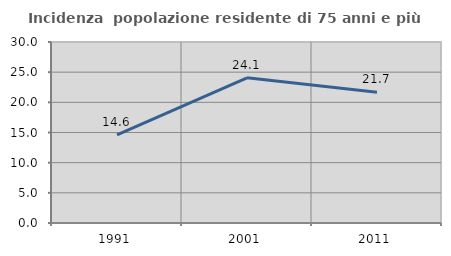
| Category | Incidenza  popolazione residente di 75 anni e più |
|---|---|
| 1991.0 | 14.62 |
| 2001.0 | 24.06 |
| 2011.0 | 21.667 |